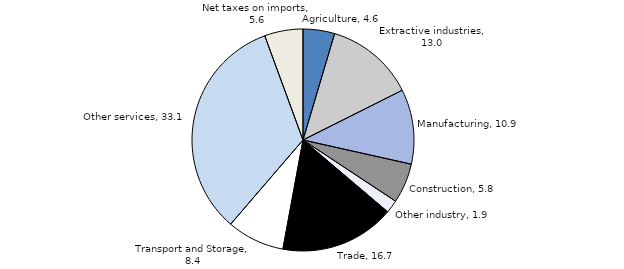
| Category | Series 0 |
|---|---|
| Agriculture | 4.6 |
| Extractive industries | 13 |
| Manufacturing | 10.9 |
| Construction | 5.8 |
| Other industry | 1.9 |
| Trade | 16.7 |
| Transportation and Storage | 8.4 |
| Other services | 33.1 |
| Net taxes on imports | 5.6 |